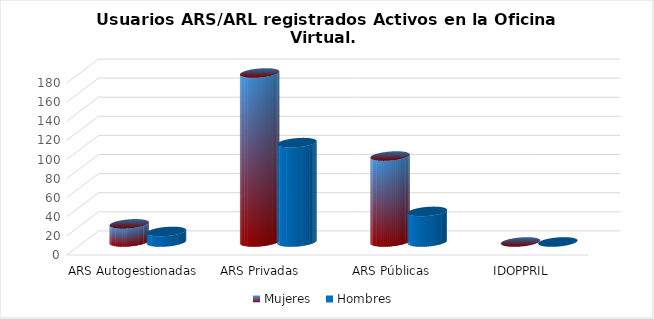
| Category | Mujeres | Hombres |
|---|---|---|
| ARS Autogestionadas | 19 | 11 |
| ARS Privadas | 177 | 104 |
| ARS Públicas | 90 | 32 |
| IDOPPRIL | 0 | 0 |